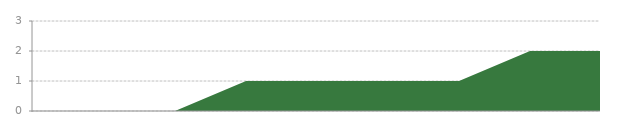
| Category | Series 0 |
|---|---|
| 0 | 0 |
| 1 | 0 |
| 2 | 0 |
| 3 | 1 |
| 4 | 1 |
| 5 | 1 |
| 6 | 1 |
| 7 | 2 |
| 8 | 2 |